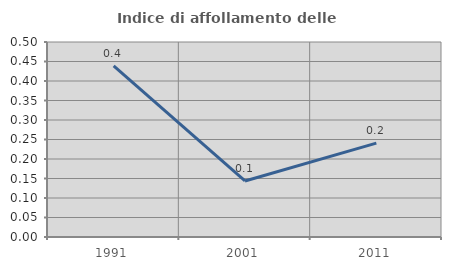
| Category | Indice di affollamento delle abitazioni  |
|---|---|
| 1991.0 | 0.439 |
| 2001.0 | 0.144 |
| 2011.0 | 0.241 |